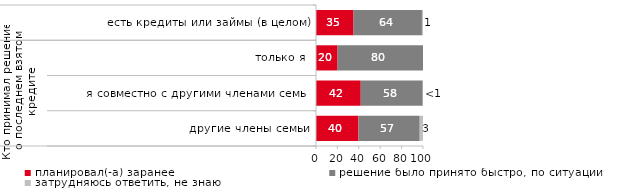
| Category | планировал(-а) заранее | решение было принято быстро, по ситуации | затрудняюсь ответить, не знаю |
|---|---|---|---|
| 0 | 35.118 | 63.885 | 0.996 |
| 1 | 20.175 | 79.825 | 0 |
| 2 | 41.818 | 57.955 | 0.227 |
| 3 | 39.695 | 57.252 | 3.053 |